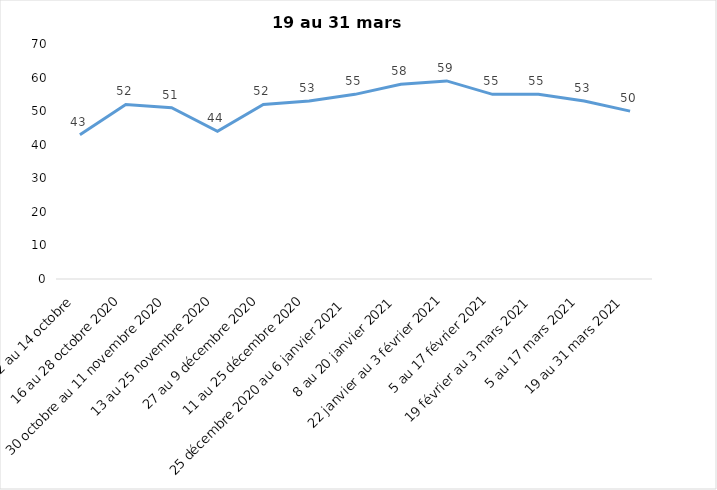
| Category | Toujours aux trois mesures |
|---|---|
| 2 au 14 octobre  | 43 |
| 16 au 28 octobre 2020 | 52 |
| 30 octobre au 11 novembre 2020 | 51 |
| 13 au 25 novembre 2020 | 44 |
| 27 au 9 décembre 2020 | 52 |
| 11 au 25 décembre 2020 | 53 |
| 25 décembre 2020 au 6 janvier 2021 | 55 |
| 8 au 20 janvier 2021 | 58 |
| 22 janvier au 3 février 2021 | 59 |
| 5 au 17 février 2021 | 55 |
| 19 février au 3 mars 2021 | 55 |
| 5 au 17 mars 2021 | 53 |
| 19 au 31 mars 2021 | 50 |